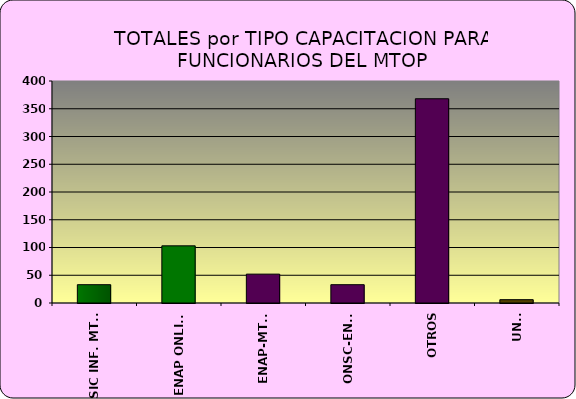
| Category | TOTALES por TIPO |
|---|---|
| SIC INF. MTOP | 33 |
| ENAP ONLINE | 103 |
| ENAP-MTOP | 52 |
| ONSC-ENAP | 33 |
| OTROS | 368 |
| UNIT | 6 |